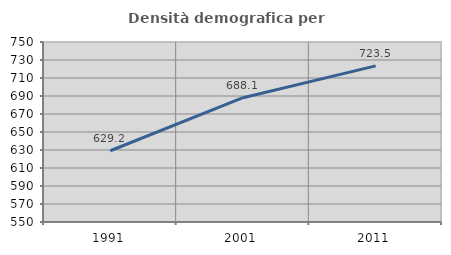
| Category | Densità demografica |
|---|---|
| 1991.0 | 629.176 |
| 2001.0 | 688.135 |
| 2011.0 | 723.511 |